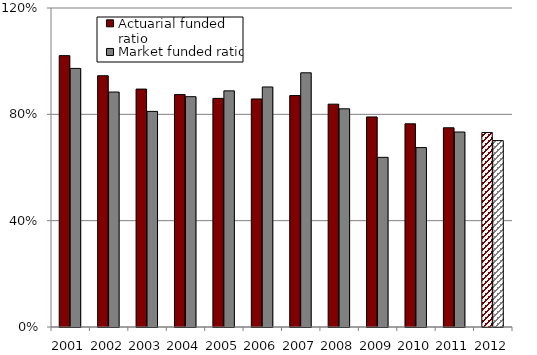
| Category | Actuarial funded ratio | Market funded ratio |
|---|---|---|
| 2001.0 | 1.021 | 0.973 |
| 2002.0 | 0.945 | 0.884 |
| 2003.0 | 0.895 | 0.811 |
| 2004.0 | 0.874 | 0.866 |
| 2005.0 | 0.86 | 0.888 |
| 2006.0 | 0.858 | 0.903 |
| 2007.0 | 0.871 | 0.956 |
| 2008.0 | 0.838 | 0.821 |
| 2009.0 | 0.79 | 0.638 |
| 2010.0 | 0.764 | 0.675 |
| 2011.0 | 0.749 | 0.734 |
| 2012.0 | 0.731 | 0.701 |